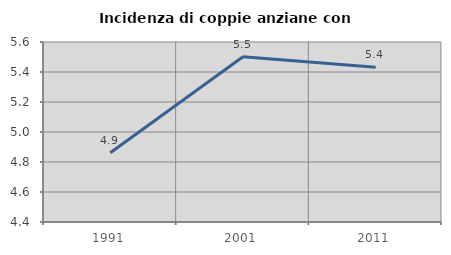
| Category | Incidenza di coppie anziane con figli |
|---|---|
| 1991.0 | 4.861 |
| 2001.0 | 5.502 |
| 2011.0 | 5.431 |